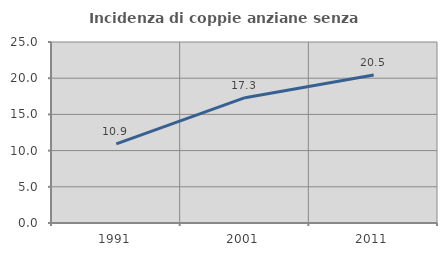
| Category | Incidenza di coppie anziane senza figli  |
|---|---|
| 1991.0 | 10.92 |
| 2001.0 | 17.308 |
| 2011.0 | 20.455 |